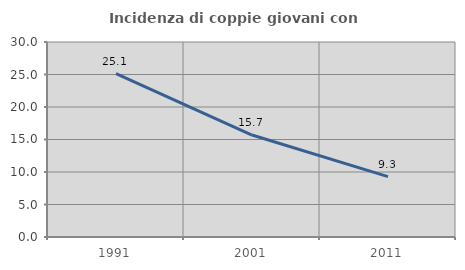
| Category | Incidenza di coppie giovani con figli |
|---|---|
| 1991.0 | 25.121 |
| 2001.0 | 15.686 |
| 2011.0 | 9.278 |